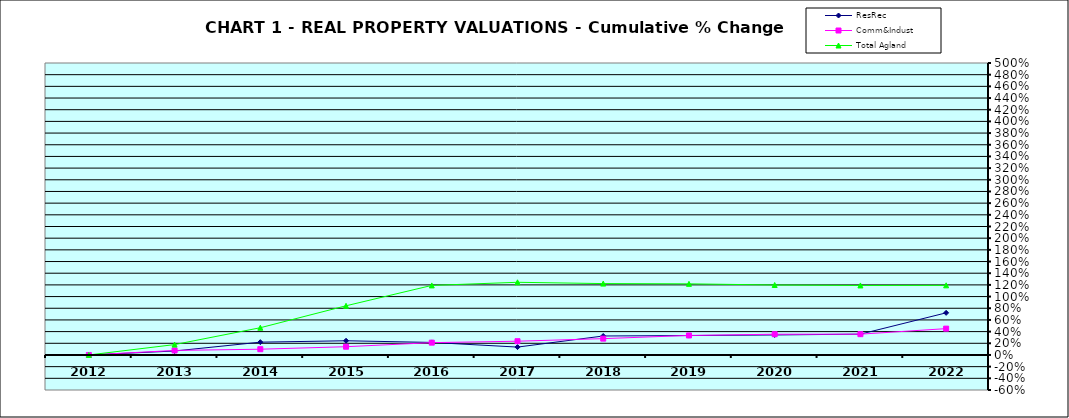
| Category | ResRec | Comm&Indust | Total Agland |
|---|---|---|---|
| 2012.0 | 0 | 0 | 0 |
| 2013.0 | 0.068 | 0.077 | 0.178 |
| 2014.0 | 0.219 | 0.098 | 0.467 |
| 2015.0 | 0.243 | 0.141 | 0.842 |
| 2016.0 | 0.215 | 0.211 | 1.191 |
| 2017.0 | 0.135 | 0.236 | 1.245 |
| 2018.0 | 0.325 | 0.28 | 1.222 |
| 2019.0 | 0.332 | 0.334 | 1.218 |
| 2020.0 | 0.343 | 0.355 | 1.198 |
| 2021.0 | 0.357 | 0.356 | 1.191 |
| 2022.0 | 0.721 | 0.451 | 1.192 |